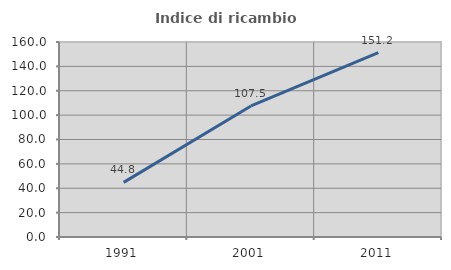
| Category | Indice di ricambio occupazionale  |
|---|---|
| 1991.0 | 44.828 |
| 2001.0 | 107.5 |
| 2011.0 | 151.22 |